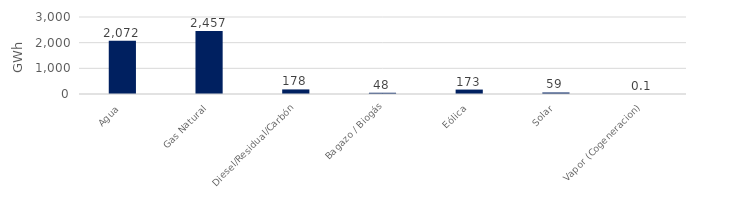
| Category | Series 0 |
|---|---|
| Agua | 2072.217 |
| Gas Natural | 2457.031 |
| Diesel/Residual/Carbón | 178.434 |
| Bagazo / Biogás | 48.48 |
| Eólica | 172.722 |
| Solar | 58.952 |
| Vapor (Cogeneracion) | 0.107 |